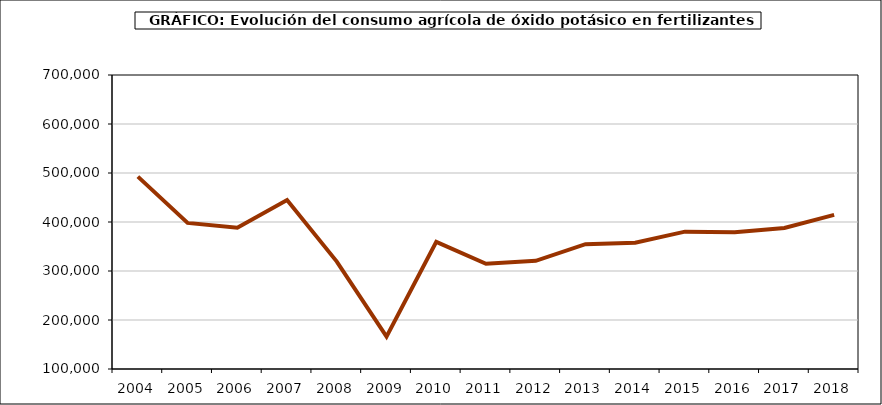
| Category | fertilizantes |
|---|---|
| 2004.0 | 492571 |
| 2005.0 | 398230 |
| 2006.0 | 388187 |
| 2007.0 | 444853 |
| 2008.0 | 319194 |
| 2009.0 | 166016 |
| 2010.0 | 359583 |
| 2011.0 | 314642 |
| 2012.0 | 320841 |
| 2013.0 | 354738 |
| 2014.0 | 357875 |
| 2015.0 | 380303 |
| 2016.0 | 379007 |
| 2017.0 | 387885 |
| 2018.0 | 414675 |